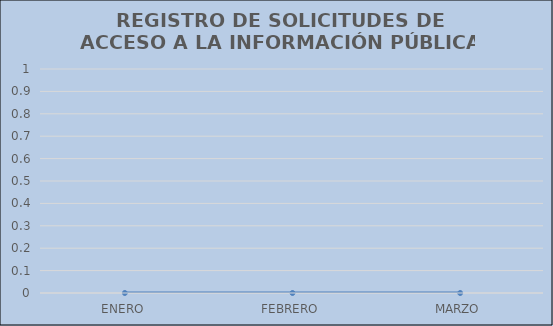
| Category | Series 0 |
|---|---|
| ENERO | 0 |
| FEBRERO | 0 |
| MARZO | 0 |